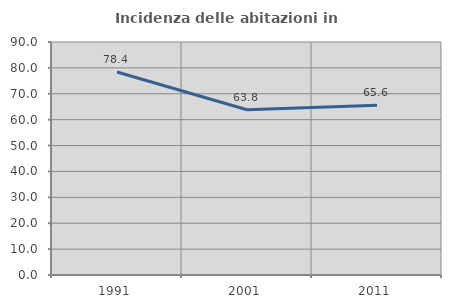
| Category | Incidenza delle abitazioni in proprietà  |
|---|---|
| 1991.0 | 78.392 |
| 2001.0 | 63.842 |
| 2011.0 | 65.605 |